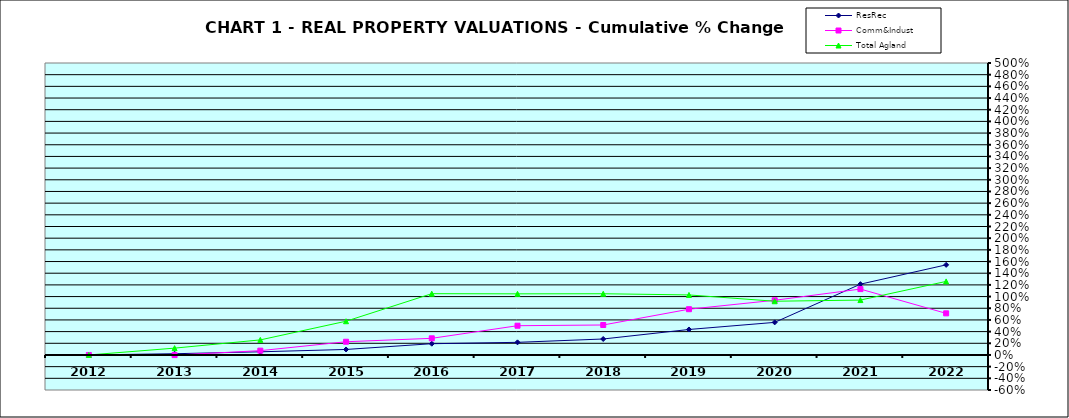
| Category | ResRec | Comm&Indust | Total Agland |
|---|---|---|---|
| 2012.0 | 0 | 0 | 0 |
| 2013.0 | 0.021 | -0.002 | 0.117 |
| 2014.0 | 0.054 | 0.074 | 0.258 |
| 2015.0 | 0.094 | 0.226 | 0.578 |
| 2016.0 | 0.193 | 0.285 | 1.049 |
| 2017.0 | 0.216 | 0.501 | 1.047 |
| 2018.0 | 0.273 | 0.513 | 1.048 |
| 2019.0 | 0.436 | 0.784 | 1.028 |
| 2020.0 | 0.558 | 0.937 | 0.92 |
| 2021.0 | 1.213 | 1.128 | 0.94 |
| 2022.0 | 1.543 | 0.713 | 1.259 |